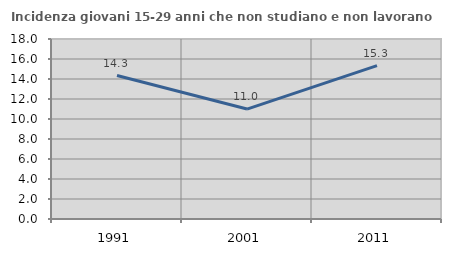
| Category | Incidenza giovani 15-29 anni che non studiano e non lavorano  |
|---|---|
| 1991.0 | 14.346 |
| 2001.0 | 10.993 |
| 2011.0 | 15.344 |